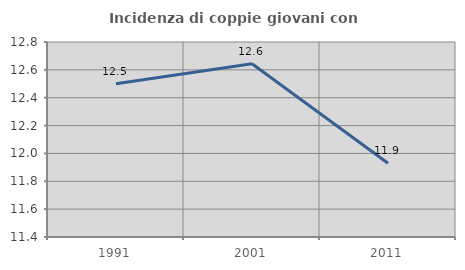
| Category | Incidenza di coppie giovani con figli |
|---|---|
| 1991.0 | 12.5 |
| 2001.0 | 12.644 |
| 2011.0 | 11.929 |